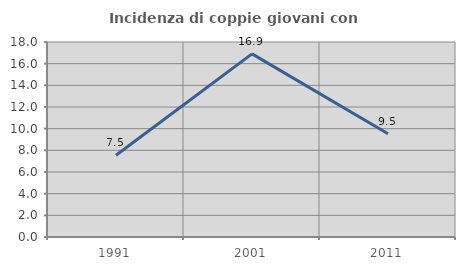
| Category | Incidenza di coppie giovani con figli |
|---|---|
| 1991.0 | 7.547 |
| 2001.0 | 16.901 |
| 2011.0 | 9.524 |